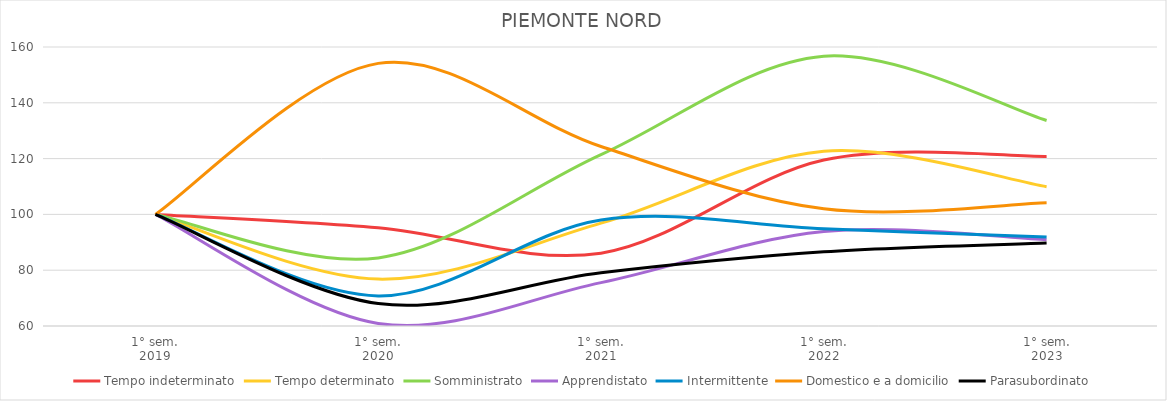
| Category | Tempo indeterminato | Tempo determinato | Somministrato | Apprendistato | Intermittente | Domestico e a domicilio | Parasubordinato |
|---|---|---|---|---|---|---|---|
| 1° sem.
2019 | 100 | 100 | 100 | 100 | 100 | 100 | 100 |
| 1° sem.
2020 | 95.242 | 76.803 | 84.403 | 60.926 | 70.795 | 154.135 | 68.037 |
| 1° sem.
2021 | 86.113 | 96.862 | 121.438 | 75.556 | 97.967 | 124.335 | 79.093 |
| 1° sem.
2022 | 119.502 | 122.625 | 156.707 | 93.889 | 94.824 | 101.996 | 86.605 |
| 1° sem.
2023 | 120.775 | 109.948 | 133.665 | 90.926 | 91.867 | 104.183 | 89.724 |